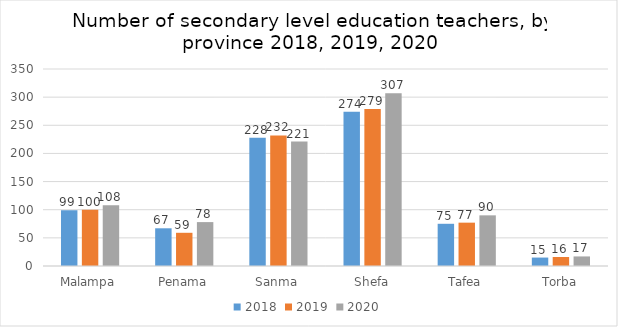
| Category | 2018 | 2019 | 2020 |
|---|---|---|---|
| Malampa | 99 | 100 | 108 |
| Penama | 67 | 59 | 78 |
| Sanma | 228 | 232 | 221 |
| Shefa | 274 | 279 | 307 |
| Tafea | 75 | 77 | 90 |
| Torba | 15 | 16 | 17 |